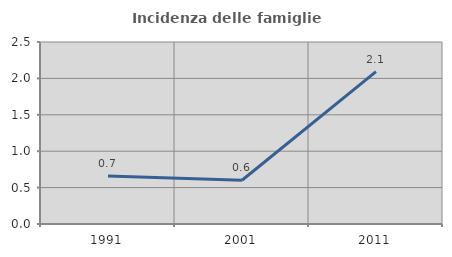
| Category | Incidenza delle famiglie numerose |
|---|---|
| 1991.0 | 0.66 |
| 2001.0 | 0.6 |
| 2011.0 | 2.093 |